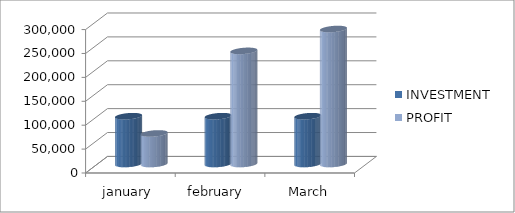
| Category | INVESTMENT  | PROFIT |
|---|---|---|
| january  | 100000 | 63911 |
| february  | 100000 | 236590 |
| March | 100000 | 282350 |